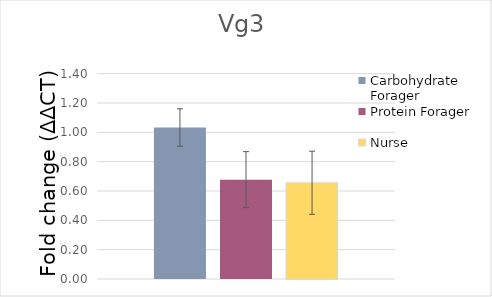
| Category | Carbohydrate Forager | Protein Forager | Nurse |
|---|---|---|---|
| Vg3 | 1.033 | 0.677 | 0.656 |